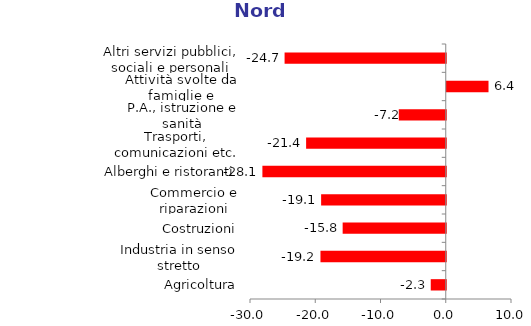
| Category | Nord |
|---|---|
| Agricoltura | -2.3 |
| Industria in senso stretto | -19.2 |
| Costruzioni | -15.8 |
| Commercio e riparazioni | -19.1 |
| Alberghi e ristoranti | -28.1 |
| Trasporti, comunicazioni etc. | -21.4 |
| P.A., istruzione e sanità | -7.2 |
| Attività svolte da famiglie e convivenze | 6.4 |
| Altri servizi pubblici, sociali e personali | -24.7 |